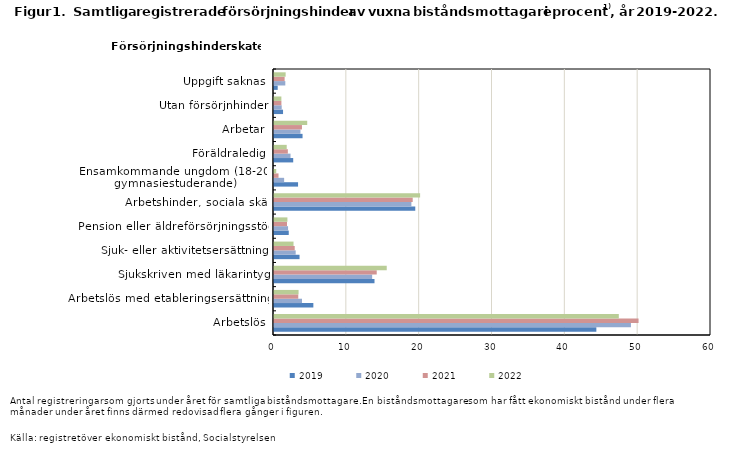
| Category | 2019 | 2020 | 2021 | 2022 |
|---|---|---|---|---|
| Arbetslös | 44.259 | 49.006 | 50.053 | 47.343 |
| Arbetslös med etableringsersättning | 5.403 | 3.846 | 3.332 | 3.375 |
| Sjukskriven med läkarintyg | 13.799 | 13.477 | 14.104 | 15.478 |
| Sjuk- eller aktivitetsersättning | 3.507 | 2.977 | 2.844 | 2.681 |
| Pension eller äldreförsörjningsstöd | 2.026 | 1.931 | 1.785 | 1.84 |
| Arbetshinder, sociala skäl | 19.397 | 18.864 | 19.044 | 20.061 |
| Ensamkommande ungdom (18-20, gymnasiestuderande) | 3.304 | 1.392 | 0.621 | 0.305 |
| Föräldraledig | 2.637 | 2.267 | 1.901 | 1.746 |
| Arbetar | 3.92 | 3.632 | 3.838 | 4.561 |
| Utan försörjnhinder | 1.242 | 1.056 | 1.017 | 1.012 |
| Uppgift saknas | 0.508 | 1.552 | 1.46 | 1.598 |